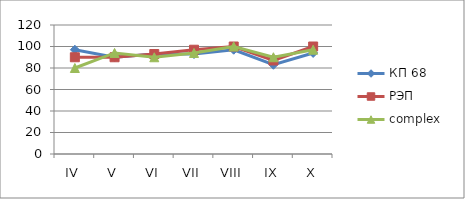
| Category | КП 68 | РЭП  | complex |
|---|---|---|---|
| IV | 97 | 90 | 80 |
| V | 90 | 90 | 94 |
| VI | 93 | 93 | 90 |
| VII | 93 | 97 | 94 |
| VIII | 97 | 100 | 100 |
| IX | 83 | 87 | 90 |
| X | 94 | 100 | 97 |